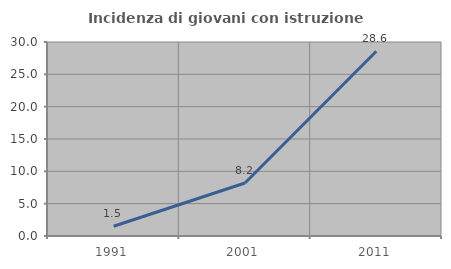
| Category | Incidenza di giovani con istruzione universitaria |
|---|---|
| 1991.0 | 1.515 |
| 2001.0 | 8.197 |
| 2011.0 | 28.571 |